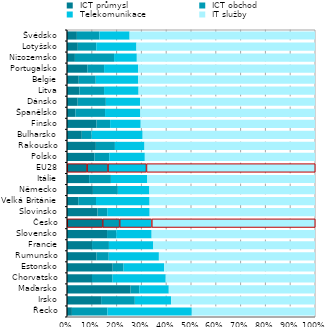
| Category |  ICT průmysl |  ICT obchod |  Telekomunikace |  IT služby |
|---|---|---|---|---|
| Řecko | 0.02 | 0.143 | 0.34 | 0.497 |
| Irsko | 0.138 | 0.136 | 0.146 | 0.58 |
| Maďarsko | 0.256 | 0.035 | 0.119 | 0.59 |
| Chorvatsko | 0.101 | 0.083 | 0.214 | 0.602 |
| Estonsko | 0.184 | 0.044 | 0.163 | 0.609 |
| Rumunsko | 0.119 | 0.049 | 0.202 | 0.629 |
| Francie | 0.101 | 0.068 | 0.179 | 0.652 |
| Slovensko | 0.161 | 0.037 | 0.143 | 0.659 |
| Česko | 0.143 | 0.068 | 0.13 | 0.659 |
| Slovinsko | 0.123 | 0.039 | 0.171 | 0.667 |
| Velká Británie | 0.045 | 0.072 | 0.216 | 0.667 |
| Německo | 0.105 | 0.101 | 0.127 | 0.668 |
| Itálie | 0.089 | 0.088 | 0.147 | 0.676 |
| EU28 | 0.08 | 0.084 | 0.155 | 0.681 |
| Polsko | 0.11 | 0.06 | 0.144 | 0.686 |
| Rakousko | 0.116 | 0.077 | 0.119 | 0.687 |
| Bulharsko | 0.06 | 0.04 | 0.206 | 0.695 |
| Finsko | 0.119 | 0.055 | 0.123 | 0.703 |
| Španělsko | 0.034 | 0.12 | 0.142 | 0.704 |
| Dánsko | 0.043 | 0.114 | 0.138 | 0.705 |
| Litva | 0.05 | 0.1 | 0.139 | 0.711 |
| Belgie | 0.047 | 0.069 | 0.171 | 0.713 |
| Portugalsko | 0.082 | 0.068 | 0.137 | 0.713 |
| Nizozemsko | 0.032 | 0.158 | 0.092 | 0.718 |
| Lotyšsko | 0.044 | 0.074 | 0.162 | 0.72 |
| Švédsko | 0.04 | 0.091 | 0.122 | 0.747 |